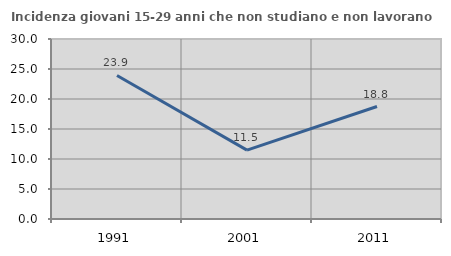
| Category | Incidenza giovani 15-29 anni che non studiano e non lavorano  |
|---|---|
| 1991.0 | 23.922 |
| 2001.0 | 11.474 |
| 2011.0 | 18.75 |